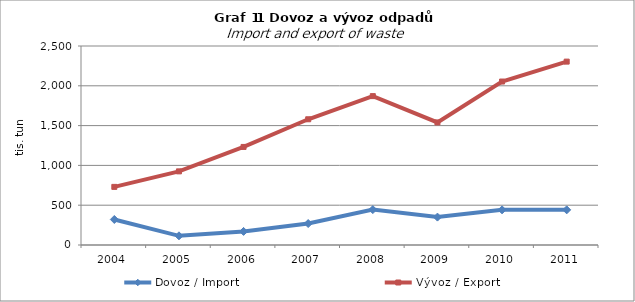
| Category | Dovoz / Import | Vývoz / Export |
|---|---|---|
| 2004.0 | 320741.895 | 730052.256 |
| 2005.0 | 115312.438 | 925028.294 |
| 2006.0 | 170670.341 | 1232050.469 |
| 2007.0 | 269615.248 | 1579463.217 |
| 2008.0 | 444548.297 | 1870337.431 |
| 2009.0 | 350457.318 | 1539548.958 |
| 2010.0 | 441726.079 | 2053594.675 |
| 2011.0 | 441699.92 | 2303711.556 |